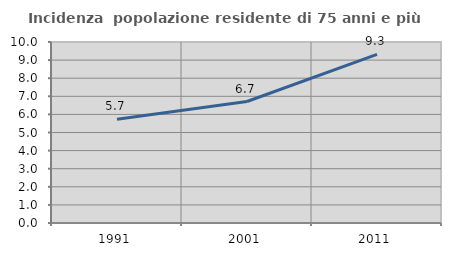
| Category | Incidenza  popolazione residente di 75 anni e più |
|---|---|
| 1991.0 | 5.727 |
| 2001.0 | 6.711 |
| 2011.0 | 9.317 |